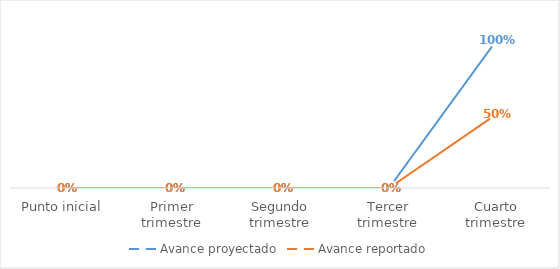
| Category | Avance proyectado | Avance reportado |
|---|---|---|
| Punto inicial | 0 | 0 |
| Primer trimestre | 0 | 0 |
| Segundo trimestre | 0 | 0 |
| Tercer trimestre | 0 | 0 |
| Cuarto trimestre | 1 | 0.5 |